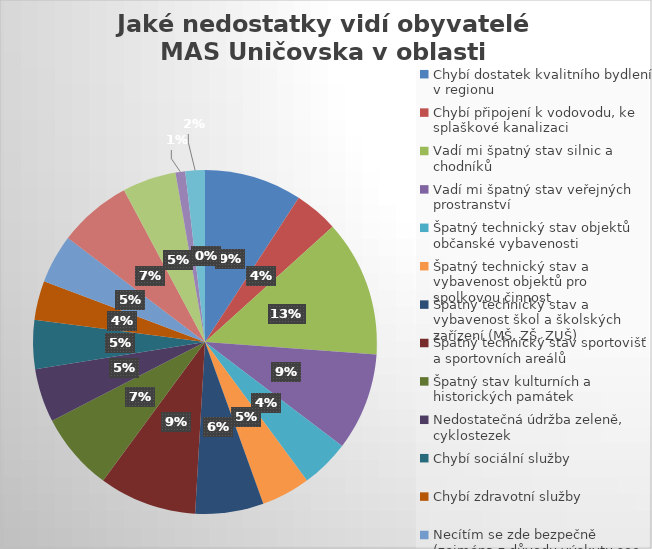
| Category | Series 0 |
|---|---|
| Chybí dostatek kvalitního bydlení v regionu | 10 |
| Chybí připojení k vodovodu, ke splaškové kanalizaci | 4.5 |
| Vadí mi špatný stav silnic a chodníků | 14 |
| Vadí mi špatný stav veřejných prostranství | 10 |
| Špatný technický stav objektů občanské vybavenosti | 5 |
| Špatný technický stav a vybavenost objektů pro spolkovou činnost  | 5 |
| Špatný technický stav a vybavenost škol a školských zařízení (MŠ, ZŠ, ZUŠ) | 7 |
| Špatný technický stav sportovišť a sportovních areálů | 10 |
| Špatný stav kulturních a historických památek | 8 |
| Nedostatečná údržba zeleně, cyklostezek | 5.5 |
| Chybí sociální služby | 5 |
| Chybí zdravotní služby  | 4 |
| Necítím se zde bezpečně (zejména z důvodu výskytu soc. patologických jevů) | 5 |
| Nedostatek kvalitních učitelů | 7.5 |
| Uzavřenost škol a nedostatečná spolupráce se školami | 5.5 |
| Nedostatečná podpora integrace cizinců   | 1 |
| Neexistence nízkoprahových center v některých částech území MAS | 2 |